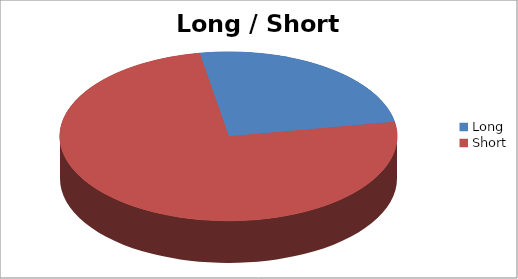
| Category | Long / Short Entries |
|---|---|
| Long | 9 |
| Short | 27 |